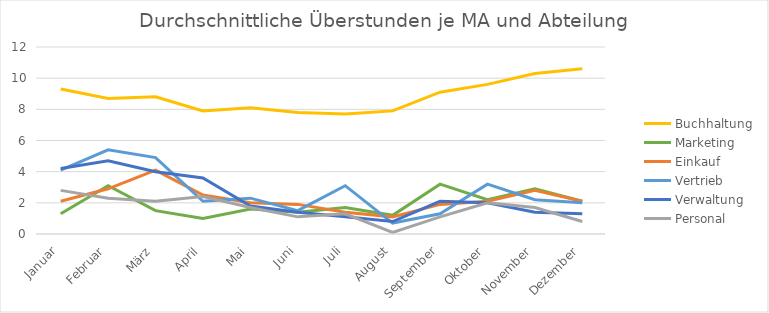
| Category | Buchhaltung | Marketing | Einkauf | Vertrieb | Verwaltung | Personal |
|---|---|---|---|---|---|---|
| Januar | 9.3 | 1.3 | 2.1 | 4.1 | 4.2 | 2.8 |
| Februar | 8.7 | 3.1 | 2.9 | 5.4 | 4.7 | 2.3 |
| März | 8.8 | 1.5 | 4.1 | 4.9 | 4 | 2.1 |
| April | 7.9 | 1 | 2.5 | 2.1 | 3.6 | 2.4 |
| Mai | 8.1 | 1.6 | 2 | 2.3 | 1.8 | 1.7 |
| Juni | 7.8 | 1.4 | 1.9 | 1.5 | 1.4 | 1.1 |
| Juli | 7.7 | 1.7 | 1.4 | 3.1 | 1.1 | 1.3 |
| August | 7.9 | 1.2 | 1.1 | 0.7 | 0.8 | 0.1 |
| September | 9.1 | 3.2 | 1.9 | 1.3 | 2.1 | 1.1 |
| Oktober | 9.6 | 2.2 | 2.1 | 3.2 | 2 | 2 |
| November | 10.3 | 2.9 | 2.8 | 2.2 | 1.4 | 1.7 |
| Dezember | 10.6 | 2.1 | 2.1 | 2 | 1.3 | 0.8 |